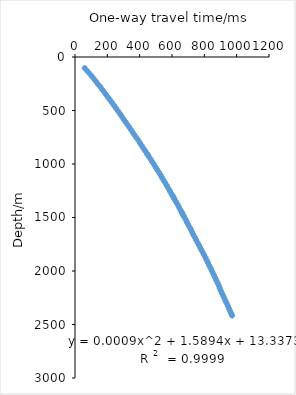
| Category | Series 0 |
|---|---|
| 60.2 | 103.4 |
| 74.1 | 128.3 |
| 89.3 | 153.4 |
| 103.0 | 178.4 |
| 116.4 | 203.4 |
| 129.3 | 228.4 |
| 141.7 | 253.4 |
| 156.3 | 278.4 |
| 168.0 | 303.4 |
| 180.7 | 328.4 |
| 192.9 | 353.4 |
| 205.0 | 378.4 |
| 217.7 | 403.4 |
| 229.5 | 428.3 |
| 241.1 | 453.3 |
| 253.8 | 478.4 |
| 265.2 | 503.4 |
| 276.7 | 528.4 |
| 288.1 | 553.4 |
| 299.6 | 578.4 |
| 311.0 | 603.4 |
| 322.6 | 628.4 |
| 334.7 | 653.4 |
| 345.3 | 678.4 |
| 356.5 | 703.4 |
| 367.6 | 728.4 |
| 379.5 | 753.4 |
| 391.8 | 778.4 |
| 401.6 | 803.4 |
| 412.4 | 828.4 |
| 423.5 | 853.4 |
| 434.1 | 878.4 |
| 445.5 | 903.4 |
| 448.8 | 911.3 |
| 455.5 | 928.4 |
| 466.9 | 953.4 |
| 476.6 | 978.4 |
| 488.1 | 1003.3 |
| 498.1 | 1028.4 |
| 508.2 | 1053.4 |
| 519.2 | 1078.4 |
| 529.4 | 1103.4 |
| 538.5 | 1128.4 |
| 548.3 | 1153.4 |
| 558.8 | 1178.4 |
| 568.3 | 1203.5 |
| 577.9 | 1228.3 |
| 587.4 | 1253.2 |
| 596.4 | 1278 |
| 604.6 | 1297.9 |
| 606.5 | 1302.8 |
| 612.0 | 1318.6 |
| 615.1 | 1327.4 |
| 624.2 | 1352 |
| 633.9 | 1376.3 |
| 641.9 | 1400.5 |
| 650.7 | 1424.5 |
| 659.0 | 1448.3 |
| 661.9 | 1454.1 |
| 667.1 | 1472.2 |
| 671.3 | 1483.5 |
| 675.7 | 1495.9 |
| 684.6 | 1519.6 |
| 692.2 | 1543.3 |
| 700.2 | 1567 |
| 708.6 | 1590.6 |
| 717.5 | 1614.3 |
| 724.8 | 1638 |
| 732.3 | 1661.6 |
| 741.1 | 1685.3 |
| 748.9 | 1709 |
| 757.2 | 1732.6 |
| 766.1 | 1756.3 |
| 774.1 | 1780 |
| 781.9 | 1803.6 |
| 790.3 | 1827.3 |
| 799.0 | 1850.9 |
| 807.0 | 1874.6 |
| 814.3 | 1898.3 |
| 822.2 | 1922 |
| 829.2 | 1945.7 |
| 837.9 | 1969.4 |
| 845.0 | 1993.1 |
| 851.8 | 2016.9 |
| 859.8 | 2040.6 |
| 867.9 | 2064.4 |
| 874.5 | 2088.1 |
| 882.3 | 2111.9 |
| 889.3 | 2135.7 |
| 895.3 | 2159.4 |
| 901.2 | 2183.3 |
| 908.7 | 2207 |
| 916.1 | 2230.8 |
| 923.9 | 2254.5 |
| 930.5 | 2278.3 |
| 938.0 | 2302.1 |
| 945.2 | 2325.8 |
| 951.7 | 2349.6 |
| 958.9 | 2373.4 |
| 966.6 | 2397.2 |
| 972.0 | 2416.3 |